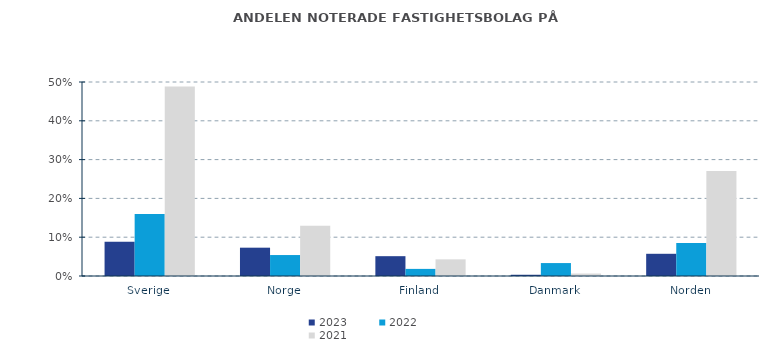
| Category | 2023 | 2022 | 2021 |
|---|---|---|---|
| Sverige | 0.088 | 0.16 | 0.489 |
| Norge | 0.073 | 0.054 | 0.129 |
| Finland | 0.051 | 0.018 | 0.043 |
| Danmark | 0.003 | 0.033 | 0.006 |
| Norden | 0.057 | 0.085 | 0.271 |